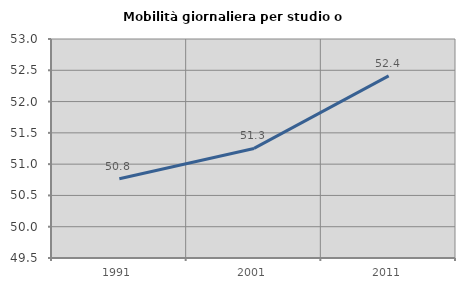
| Category | Mobilità giornaliera per studio o lavoro |
|---|---|
| 1991.0 | 50.767 |
| 2001.0 | 51.251 |
| 2011.0 | 52.41 |